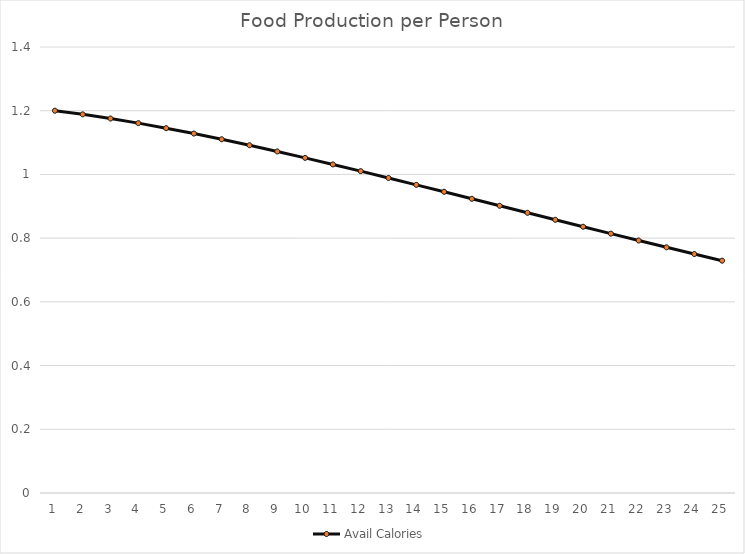
| Category | Avail Calories |
|---|---|
| 0 | 1.2 |
| 1 | 1.189 |
| 2 | 1.176 |
| 3 | 1.161 |
| 4 | 1.145 |
| 5 | 1.128 |
| 6 | 1.11 |
| 7 | 1.092 |
| 8 | 1.072 |
| 9 | 1.052 |
| 10 | 1.031 |
| 11 | 1.01 |
| 12 | 0.989 |
| 13 | 0.967 |
| 14 | 0.945 |
| 15 | 0.924 |
| 16 | 0.902 |
| 17 | 0.88 |
| 18 | 0.858 |
| 19 | 0.836 |
| 20 | 0.814 |
| 21 | 0.793 |
| 22 | 0.771 |
| 23 | 0.75 |
| 24 | 0.729 |